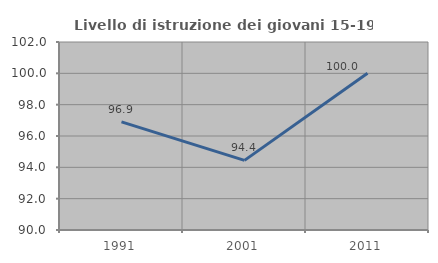
| Category | Livello di istruzione dei giovani 15-19 anni |
|---|---|
| 1991.0 | 96.899 |
| 2001.0 | 94.444 |
| 2011.0 | 100 |